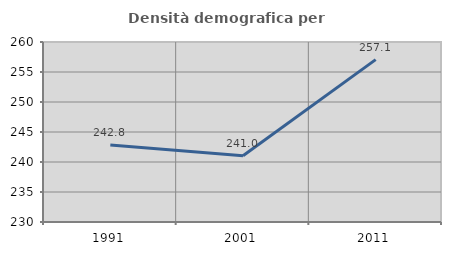
| Category | Densità demografica |
|---|---|
| 1991.0 | 242.84 |
| 2001.0 | 241.037 |
| 2011.0 | 257.058 |